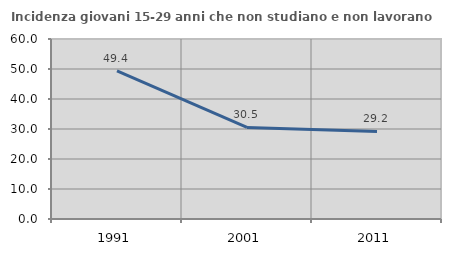
| Category | Incidenza giovani 15-29 anni che non studiano e non lavorano  |
|---|---|
| 1991.0 | 49.372 |
| 2001.0 | 30.519 |
| 2011.0 | 29.185 |